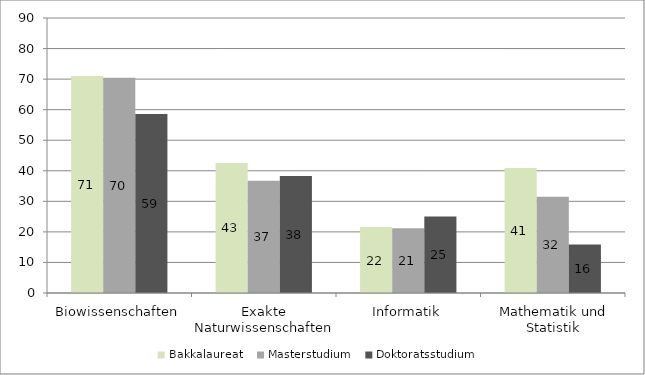
| Category | Bakkalaureat  | Masterstudium  | Doktoratsstudium  |
|---|---|---|---|
| Biowissenschaften | 71.006 | 70.442 | 58.621 |
| Exakte Naturwissenschaften | 42.552 | 36.758 | 38.308 |
| Informatik | 21.591 | 21.2 | 25 |
| Mathematik und Statistik | 40.873 | 31.522 | 15.909 |